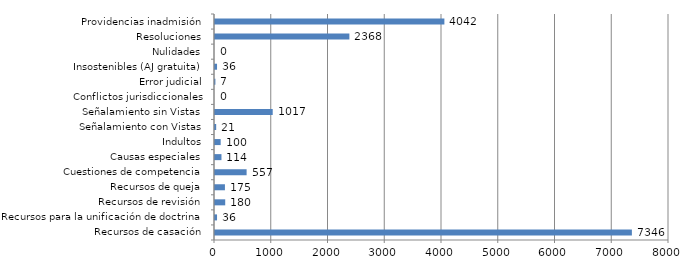
| Category | Series 0 |
|---|---|
| Recursos de casación | 7346 |
| Recursos para la unificación de doctrina | 36 |
| Recursos de revisión | 180 |
| Recursos de queja | 175 |
| Cuestiones de competencia | 557 |
| Causas especiales | 114 |
| Indultos | 100 |
| Señalamiento con Vistas | 21 |
| Señalamiento sin Vistas | 1017 |
| Conflictos jurisdiccionales | 0 |
| Error judicial | 7 |
| Insostenibles (AJ gratuita) | 36 |
| Nulidades | 0 |
| Resoluciones | 2368 |
| Providencias inadmisión | 4042 |